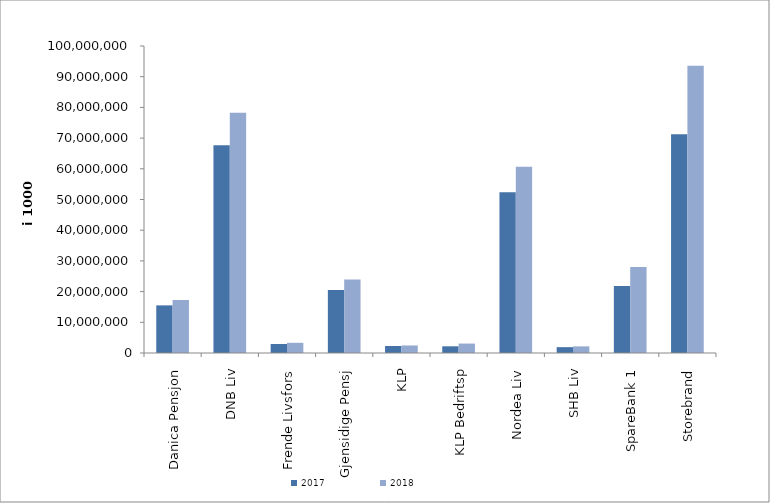
| Category | 2017 | 2018 |
|---|---|---|
| Danica Pensjon | 15516241.074 | 17266330.386 |
| DNB Liv | 67680359 | 78277486.438 |
| Frende Livsfors | 2925269 | 3320021 |
| Gjensidige Pensj | 20522578 | 23904710 |
| KLP | 2288839.257 | 2451095.821 |
| KLP Bedriftsp | 2183015 | 3075141 |
| Nordea Liv | 52390620 | 60641550 |
| SHB Liv | 1903610 | 2163599 |
| SpareBank 1 | 21802567.12 | 28011120.556 |
| Storebrand | 71261439.237 | 93597754.061 |